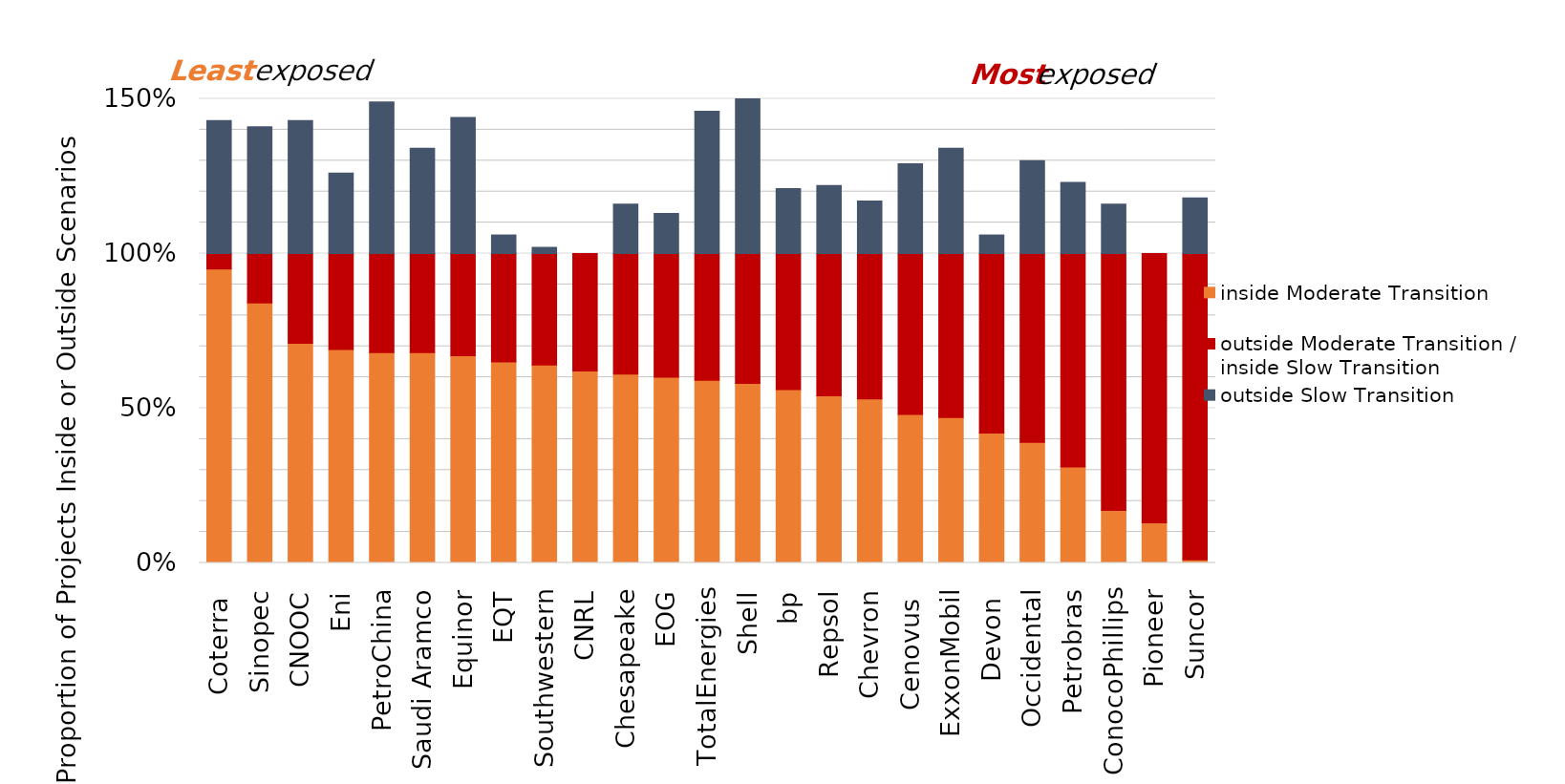
| Category | inside Moderate Transition  | outside Moderate Transition / 
inside Slow Transition  | outside Slow Transition  |
|---|---|---|---|
| Coterra  | 0.95 | 0.05 | 0.43 |
| Sinopec | 0.84 | 0.16 | 0.41 |
| CNOOC | 0.71 | 0.29 | 0.43 |
| Eni | 0.69 | 0.31 | 0.26 |
| PetroChina | 0.68 | 0.32 | 0.49 |
| Saudi Aramco | 0.68 | 0.32 | 0.34 |
| Equinor | 0.67 | 0.33 | 0.44 |
| EQT | 0.65 | 0.35 | 0.06 |
| Southwestern | 0.64 | 0.36 | 0.02 |
| CNRL | 0.62 | 0.38 | 0 |
| Chesapeake | 0.61 | 0.39 | 0.16 |
| EOG | 0.6 | 0.4 | 0.13 |
| TotalEnergies | 0.59 | 0.41 | 0.46 |
| Shell | 0.58 | 0.42 | 0.52 |
| bp | 0.56 | 0.44 | 0.21 |
| Repsol | 0.54 | 0.46 | 0.22 |
| Chevron | 0.53 | 0.47 | 0.17 |
| Cenovus  | 0.48 | 0.52 | 0.29 |
| ExxonMobil | 0.47 | 0.53 | 0.34 |
| Devon  | 0.42 | 0.58 | 0.06 |
| Occidental | 0.39 | 0.61 | 0.3 |
| Petrobras | 0.31 | 0.69 | 0.23 |
| ConocoPhillips | 0.17 | 0.83 | 0.16 |
| Pioneer | 0.13 | 0.87 | 0 |
| Suncor | 0.01 | 0.99 | 0.18 |